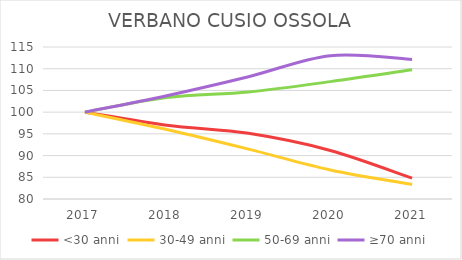
| Category | <30 anni | 30-49 anni | 50-69 anni | ≥70 anni |
|---|---|---|---|---|
| 2017.0 | 100 | 100 | 100 | 100 |
| 2018.0 | 96.998 | 96.008 | 103.351 | 103.795 |
| 2019.0 | 95.122 | 91.492 | 104.659 | 108.159 |
| 2020.0 | 91.182 | 86.693 | 107.029 | 112.998 |
| 2021.0 | 84.803 | 83.355 | 109.767 | 112.144 |